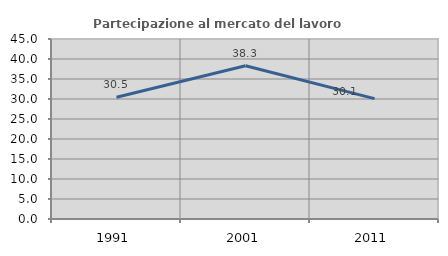
| Category | Partecipazione al mercato del lavoro  femminile |
|---|---|
| 1991.0 | 30.451 |
| 2001.0 | 38.298 |
| 2011.0 | 30.093 |